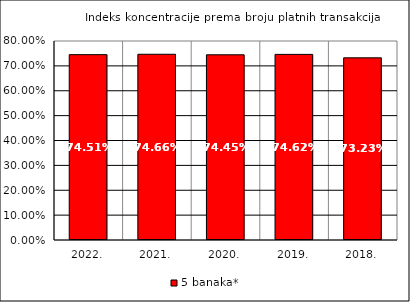
| Category | 5 banaka* |
|---|---|
| 2022. | 0.745 |
| 2021. | 0.747 |
| 2020. | 0.744 |
| 2019. | 0.746 |
| 2018. | 0.732 |